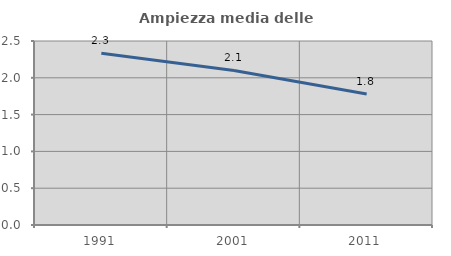
| Category | Ampiezza media delle famiglie |
|---|---|
| 1991.0 | 2.332 |
| 2001.0 | 2.1 |
| 2011.0 | 1.779 |